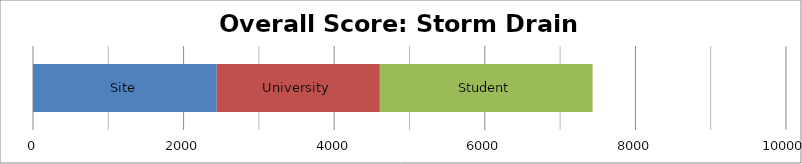
| Category | Site | University | Student |
|---|---|---|---|
| 0 | 2439.875 | 2166.375 | 2825.5 |